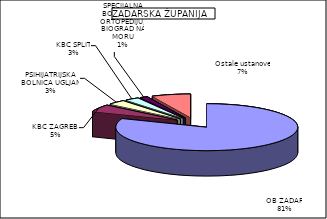
| Category | Series 0 |
|---|---|
| OB ZADAR | 80.987 |
| KBC ZAGREB  | 4.977 |
| PSIHIJATRIJSKA BOLNICA UGLJAN | 3.195 |
| KBC SPLIT | 2.547 |
| SPECIJALNA BOLNICA ZA ORTOPEDIJU, BIOGRAD NA MORU | 1.376 |
| Ostale ustanove | 6.918 |